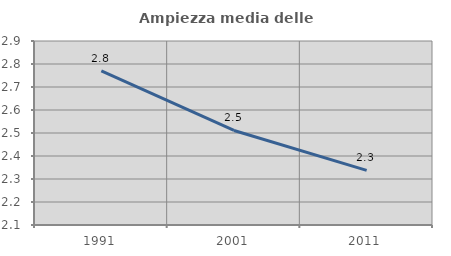
| Category | Ampiezza media delle famiglie |
|---|---|
| 1991.0 | 2.77 |
| 2001.0 | 2.511 |
| 2011.0 | 2.337 |